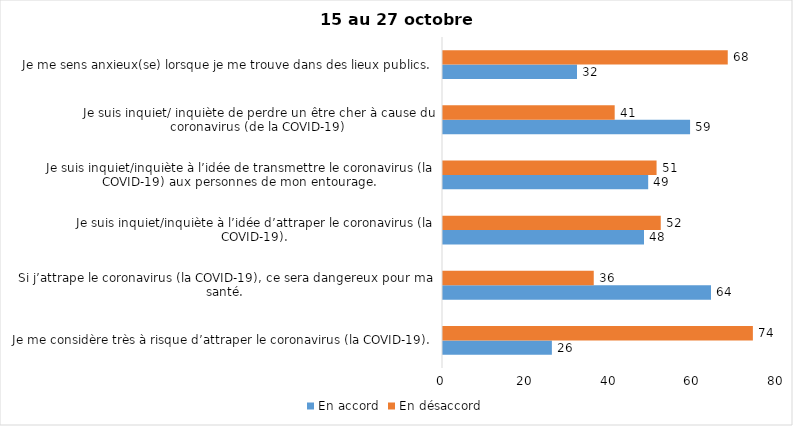
| Category | En accord | En désaccord |
|---|---|---|
| Je me considère très à risque d’attraper le coronavirus (la COVID-19). | 26 | 74 |
| Si j’attrape le coronavirus (la COVID-19), ce sera dangereux pour ma santé. | 64 | 36 |
| Je suis inquiet/inquiète à l’idée d’attraper le coronavirus (la COVID-19). | 48 | 52 |
| Je suis inquiet/inquiète à l’idée de transmettre le coronavirus (la COVID-19) aux personnes de mon entourage. | 49 | 51 |
| Je suis inquiet/ inquiète de perdre un être cher à cause du coronavirus (de la COVID-19) | 59 | 41 |
| Je me sens anxieux(se) lorsque je me trouve dans des lieux publics. | 32 | 68 |